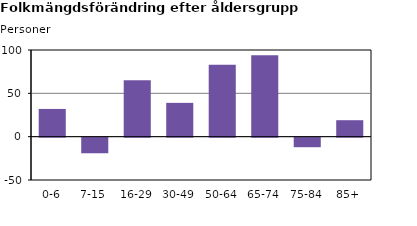
| Category | Series 2 |
|---|---|
| 0-6 | 32 |
| 7-15 | -18 |
| 16-29 | 65 |
| 30-49 | 39 |
| 50-64 | 83 |
| 65-74 | 94 |
| 75-84 | -11 |
| 85+ | 19 |